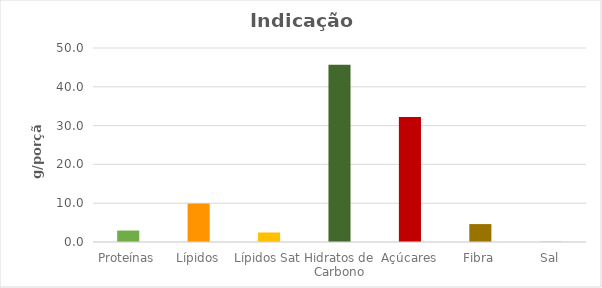
| Category | Series 0 |
|---|---|
| Proteínas | 2.957 |
| Lípidos | 9.911 |
| Lípidos Sat | 2.453 |
| Hidratos de Carbono | 45.672 |
| Açúcares | 32.247 |
| Fibra | 4.619 |
| Sal | 0.074 |